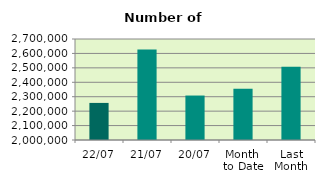
| Category | Series 0 |
|---|---|
| 22/07 | 2257006 |
| 21/07 | 2626986 |
| 20/07 | 2308148 |
| Month 
to Date | 2354626.375 |
| Last
Month | 2507488.545 |